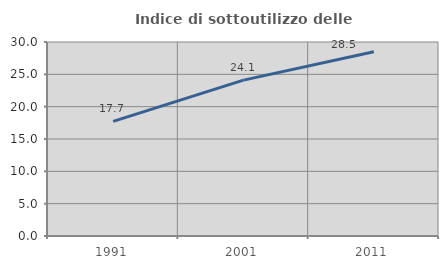
| Category | Indice di sottoutilizzo delle abitazioni  |
|---|---|
| 1991.0 | 17.721 |
| 2001.0 | 24.101 |
| 2011.0 | 28.479 |